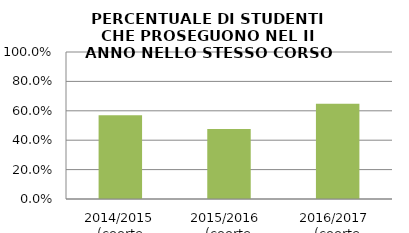
| Category | 2014/2015 (coorte 2013/14) 2015/2016  (coorte 2014/15) 2016/2017  (coorte 2015/16) |
|---|---|
| 2014/2015 (coorte 2013/14) | 0.57 |
| 2015/2016  (coorte 2014/15) | 0.477 |
| 2016/2017  (coorte 2015/16) | 0.648 |